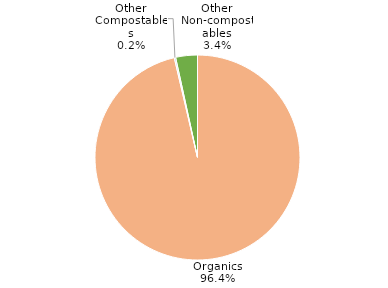
| Category | Series 0 |
|---|---|
| Organics | 0.964 |
| Other Compostables | 0.002 |
| Other Non-compostables | 0.034 |